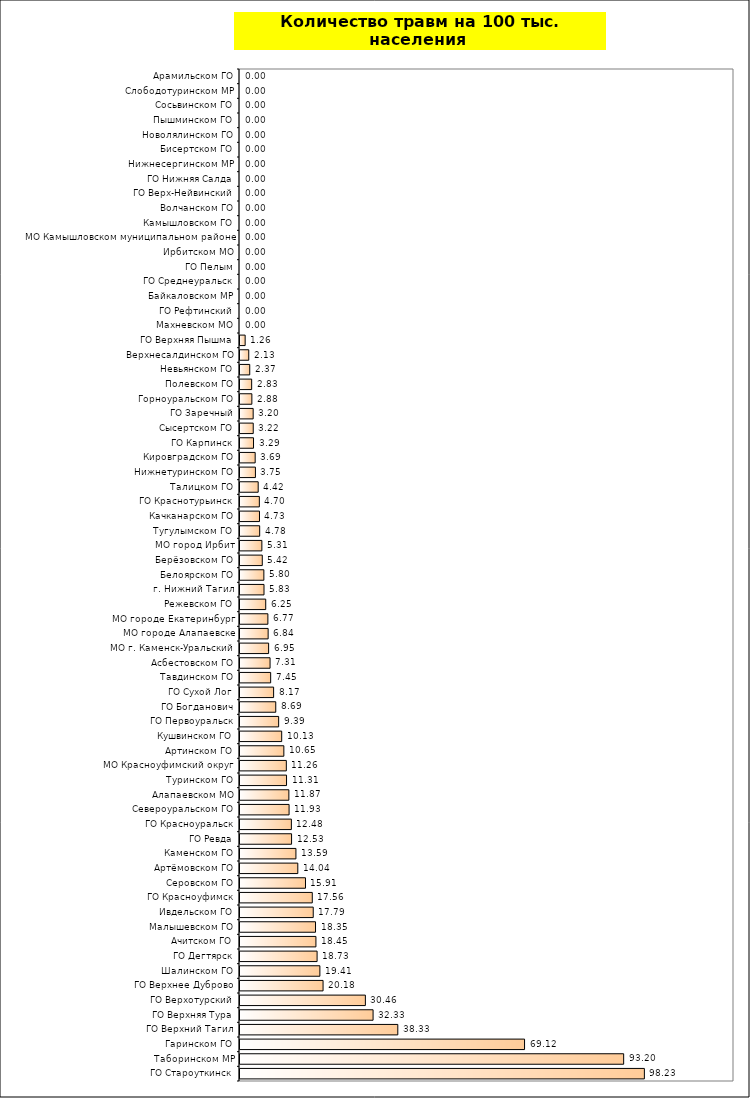
| Category | Series 0 |
|---|---|
| ГО Староуткинск | 98.232 |
| Таборинском МР | 93.197 |
| Гаринском ГО | 69.124 |
| ГО Верхний Тагил | 38.332 |
| ГО Верхняя Тура | 32.328 |
| ГО Верхотурский | 30.458 |
| ГО Верхнее Дуброво | 20.178 |
| Шалинском ГО | 19.406 |
| ГО Дегтярск | 18.729 |
| Ачитском ГО | 18.446 |
| Малышевском ГО | 18.347 |
| Ивдельском ГО | 17.79 |
| ГО Красноуфимск | 17.56 |
| Серовском ГО | 15.907 |
| Артёмовском ГО | 14.043 |
| Каменском ГО | 13.588 |
| ГО Ревда | 12.526 |
| ГО Красноуральск | 12.482 |
| Североуральском ГО | 11.925 |
| Алапаевском МО | 11.869 |
| Туринском ГО | 11.306 |
| МО Красноуфимский округ | 11.257 |
| Артинском ГО | 10.653 |
| Кушвинском ГО | 10.13 |
| ГО Первоуральск | 9.387 |
| ГО Богданович | 8.687 |
| ГО Сухой Лог | 8.168 |
| Тавдинском ГО | 7.449 |
| Асбестовском ГО | 7.306 |
| МО г. Каменск-Уральский | 6.95 |
| МО городе Алапаевске | 6.837 |
| МО городе Екатеринбург | 6.774 |
| Режевском ГО | 6.25 |
| г. Нижний Тагил | 5.832 |
| Белоярском ГО | 5.797 |
| Берёзовском ГО | 5.416 |
| МО город Ирбит | 5.31 |
| Тугулымском ГО | 4.781 |
| Качканарском ГО | 4.735 |
| ГО Краснотурьинск | 4.7 |
| Талицком ГО | 4.42 |
| Нижнетуринском ГО | 3.749 |
| Кировградском ГО | 3.688 |
| ГО Карпинск | 3.286 |
| Сысертском ГО | 3.216 |
| ГО Заречный | 3.202 |
| Горноуральском ГО | 2.882 |
| Полевском ГО | 2.832 |
| Невьянском ГО | 2.365 |
| Верхнесалдинском ГО | 2.126 |
| ГО Верхняя Пышма | 1.256 |
| Махневском МО | 0 |
| ГО Рефтинский | 0 |
| Байкаловском МР | 0 |
| ГО Среднеуральск | 0 |
| ГО Пелым | 0 |
| Ирбитском МО | 0 |
| МО Камышловском муниципальном районе | 0 |
| Камышловском ГО | 0 |
| Волчанском ГО | 0 |
| ГО Верх-Нейвинский | 0 |
| ГО Нижняя Салда | 0 |
| Нижнесергинском МР | 0 |
| Бисертском ГО | 0 |
| Новолялинском ГО | 0 |
| Пышминском ГО | 0 |
| Сосьвинском ГО | 0 |
| Слободотуринском МР | 0 |
| Арамильском ГО | 0 |